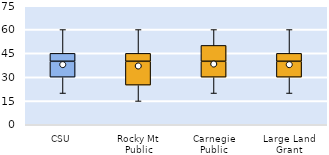
| Category | 25th | 50th | 75th |
|---|---|---|---|
| CSU | 30 | 10 | 5 |
| Rocky Mt Public | 25 | 15 | 5 |
| Carnegie Public | 30 | 10 | 10 |
| Large Land Grant | 30 | 10 | 5 |